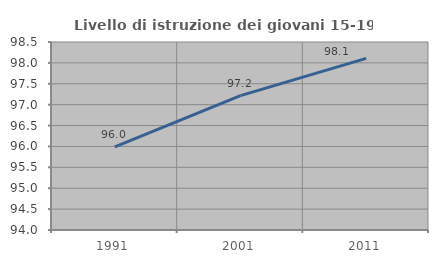
| Category | Livello di istruzione dei giovani 15-19 anni |
|---|---|
| 1991.0 | 95.992 |
| 2001.0 | 97.215 |
| 2011.0 | 98.107 |